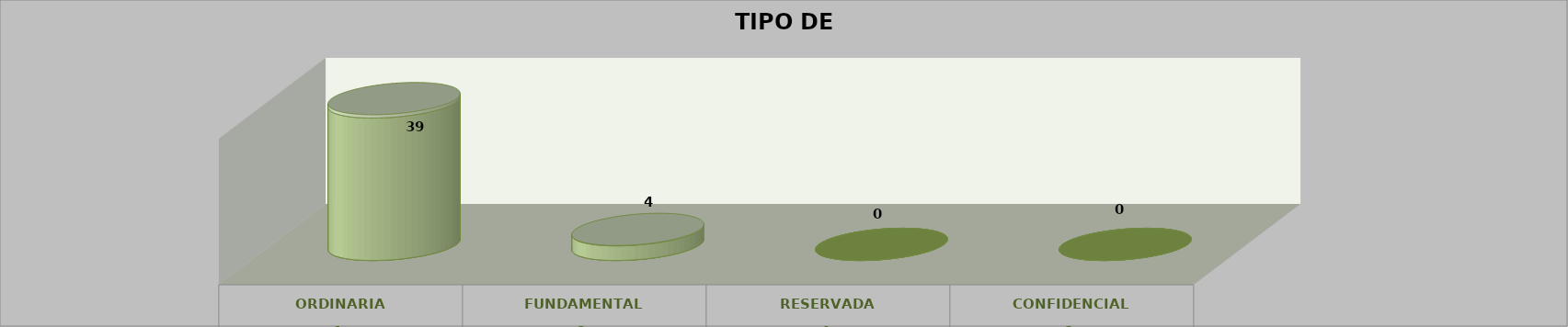
| Category | Series 0 | Series 2 | Series 1 | Series 3 | Series 4 |
|---|---|---|---|---|---|
| 0 |  |  |  | 39 | 0.907 |
| 1 |  |  |  | 4 | 0.093 |
| 2 |  |  |  | 0 | 0 |
| 3 |  |  |  | 0 | 0 |